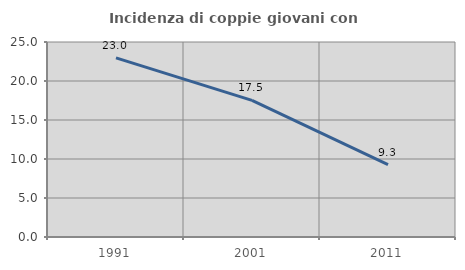
| Category | Incidenza di coppie giovani con figli |
|---|---|
| 1991.0 | 22.969 |
| 2001.0 | 17.517 |
| 2011.0 | 9.269 |